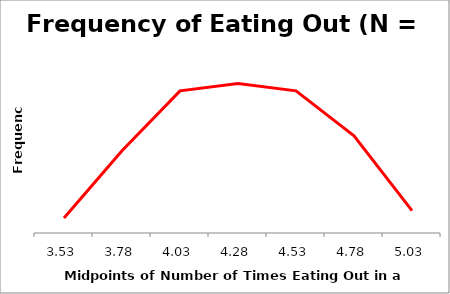
| Category | Total |
|---|---|
| 3.53 | 2 |
| 3.78 | 11 |
| 4.03 | 19 |
| 4.28 | 20 |
| 4.53 | 19 |
| 4.78 | 13 |
| 5.03 | 3 |